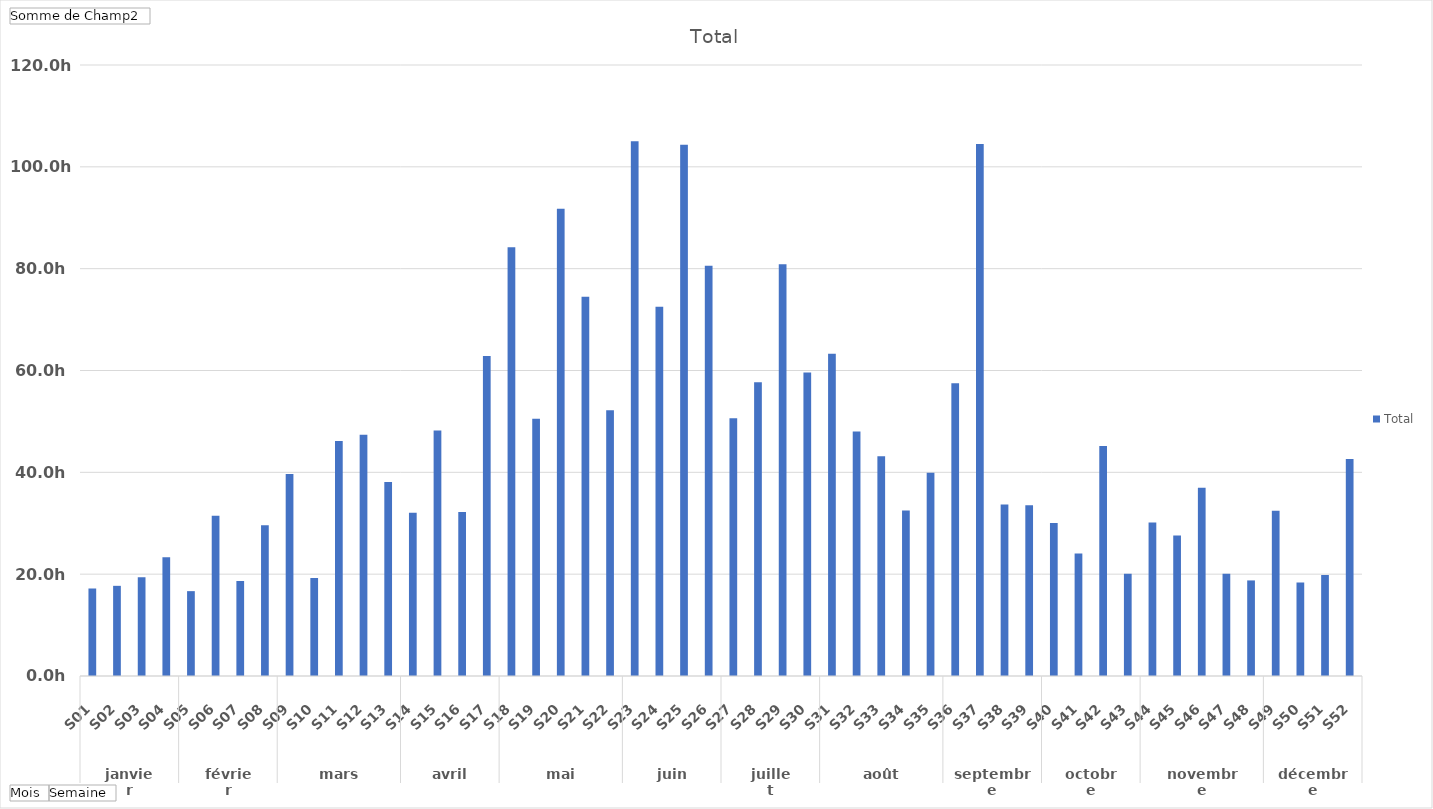
| Category | Total |
|---|---|
| 0 | 17.188 |
| 1 | 17.708 |
| 2 | 19.375 |
| 3 | 23.333 |
| 4 | 16.667 |
| 5 | 31.458 |
| 6 | 18.646 |
| 7 | 29.583 |
| 8 | 39.688 |
| 9 | 19.271 |
| 10 | 46.146 |
| 11 | 47.375 |
| 12 | 38.125 |
| 13 | 32.083 |
| 14 | 48.229 |
| 15 | 32.188 |
| 16 | 62.854 |
| 17 | 84.229 |
| 18 | 50.521 |
| 19 | 91.792 |
| 20 | 74.479 |
| 21 | 52.188 |
| 22 | 105.042 |
| 23 | 72.5 |
| 24 | 104.333 |
| 25 | 80.562 |
| 26 | 50.625 |
| 27 | 57.708 |
| 28 | 80.875 |
| 29 | 59.583 |
| 30 | 63.292 |
| 31 | 48.021 |
| 32 | 43.146 |
| 33 | 32.521 |
| 34 | 39.917 |
| 35 | 57.5 |
| 36 | 104.5 |
| 37 | 33.688 |
| 38 | 33.542 |
| 39 | 30.062 |
| 40 | 24.083 |
| 41 | 45.188 |
| 42 | 20.104 |
| 43 | 30.146 |
| 44 | 27.604 |
| 45 | 36.979 |
| 46 | 20.083 |
| 47 | 18.771 |
| 48 | 32.458 |
| 49 | 18.375 |
| 50 | 19.833 |
| 51 | 42.625 |